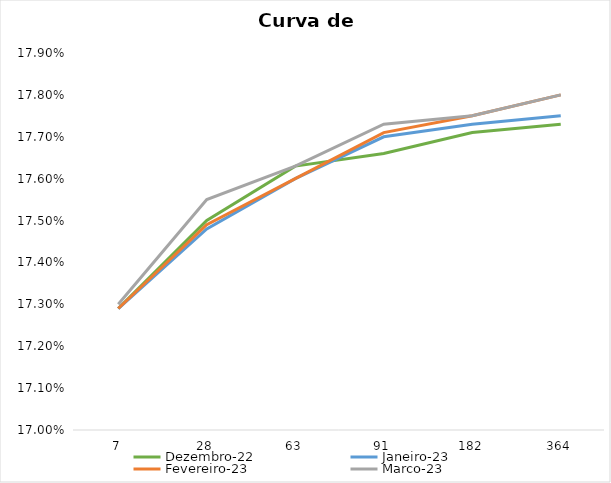
| Category | Dezembro-22 | Janeiro-23 | Fevereiro-23  | Março-23  |
|---|---|---|---|---|
| 7.0 | 0.173 | 0.173 | 0.173 | 0.173 |
| 28.0 | 0.175 | 0.175 | 0.175 | 0.176 |
| 63.0 | 0.176 | 0.176 | 0.176 | 0.176 |
| 91.0 | 0.177 | 0.177 | 0.177 | 0.177 |
| 182.0 | 0.177 | 0.177 | 0.178 | 0.178 |
| 364.0 | 0.177 | 0.178 | 0.178 | 0.178 |